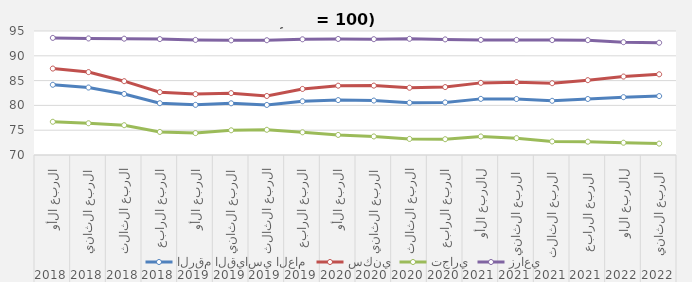
| Category | الرقم القياسي العام | سكني | تجاري | زراعي |
|---|---|---|---|---|
| 0 | 84.16 | 87.43 | 76.7 | 93.61 |
| 1 | 83.603 | 86.713 | 76.403 | 93.5 |
| 2 | 82.31 | 84.883 | 76.01 | 93.45 |
| 3 | 80.443 | 82.67 | 74.65 | 93.37 |
| 4 | 80.11 | 82.277 | 74.417 | 93.203 |
| 5 | 80.427 | 82.473 | 74.983 | 93.11 |
| 6 | 80.093 | 81.9 | 75.083 | 93.14 |
| 7 | 80.833 | 83.32 | 74.577 | 93.33 |
| 8 | 81.07 | 83.973 | 74.047 | 93.397 |
| 9 | 80.977 | 83.99 | 73.74 | 93.353 |
| 10 | 80.538 | 83.562 | 73.242 | 93.424 |
| 11 | 80.6 | 83.696 | 73.187 | 93.307 |
| 12 | 81.315 | 84.54 | 73.736 | 93.206 |
| 13 | 81.291 | 84.687 | 73.398 | 93.204 |
| 14 | 80.925 | 84.473 | 72.728 | 93.164 |
| 15 | 81.295 | 85.089 | 72.682 | 93.157 |
| 16 | 81.662 | 85.816 | 72.474 | 92.745 |
| 17 | 81.879 | 86.272 | 72.295 | 92.633 |